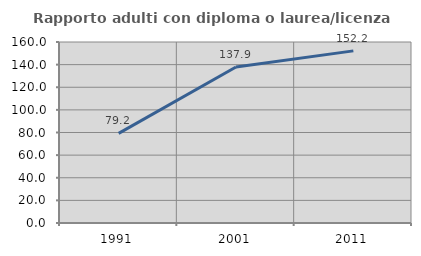
| Category | Rapporto adulti con diploma o laurea/licenza media  |
|---|---|
| 1991.0 | 79.217 |
| 2001.0 | 137.919 |
| 2011.0 | 152.161 |